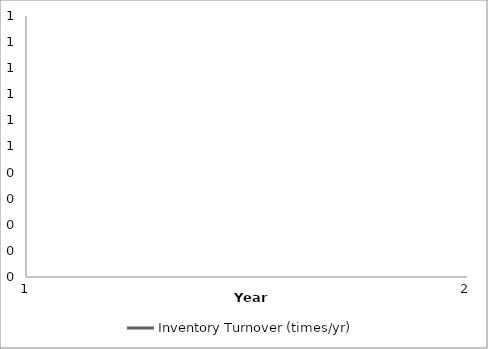
| Category | Inventory Turnover (times/yr) |
|---|---|
| 0 | 0 |
| 1 | 0 |
| 2 | 0 |
| 3 | 0 |
| 4 | 0 |
| 5 | 0 |
| 6 | 0 |
| 7 | 0 |
| 8 | 0 |
| 9 | 0 |